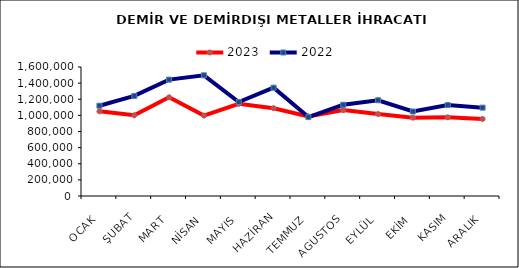
| Category | 2023 | 2022 |
|---|---|---|
| OCAK | 1050062.773 | 1119845.119 |
| ŞUBAT | 1000956.812 | 1241104.326 |
| MART | 1224195.901 | 1443490.55 |
| NİSAN | 997221.038 | 1496963.643 |
| MAYIS | 1143067.491 | 1165756.345 |
| HAZİRAN | 1088852.461 | 1343438.355 |
| TEMMUZ | 987879.025 | 978534.42 |
| AGUSTOS | 1064965.198 | 1131631.199 |
| EYLÜL | 1016302.605 | 1187644.252 |
| EKİM | 971151.229 | 1048139.256 |
| KASIM | 975732.967 | 1127724.568 |
| ARALIK | 955374.277 | 1095772.145 |